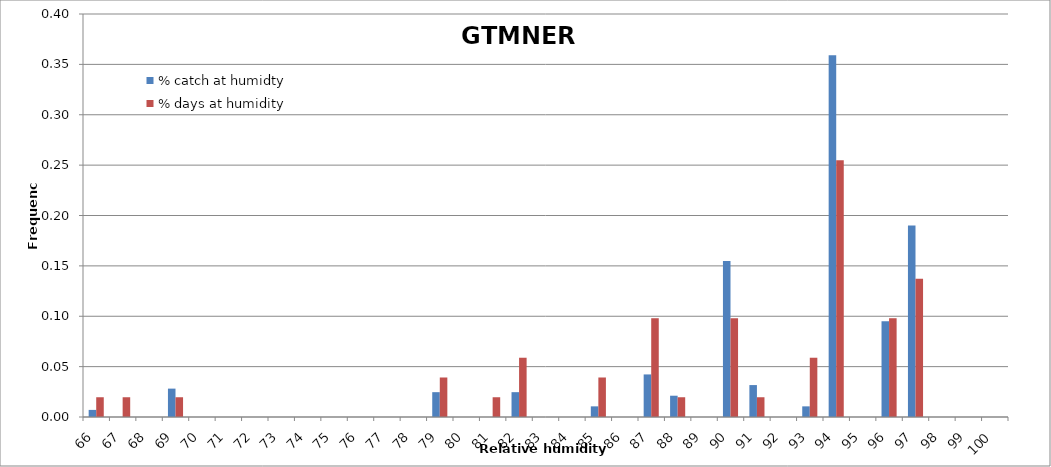
| Category | % catch at humidty | % days at humidity |
|---|---|---|
| 66.0 | 0.007 | 0.02 |
| 67.0 | 0 | 0.02 |
| 68.0 | 0 | 0 |
| 69.0 | 0.028 | 0.02 |
| 70.0 | 0 | 0 |
| 71.0 | 0 | 0 |
| 72.0 | 0 | 0 |
| 73.0 | 0 | 0 |
| 74.0 | 0 | 0 |
| 75.0 | 0 | 0 |
| 76.0 | 0 | 0 |
| 77.0 | 0 | 0 |
| 78.0 | 0 | 0 |
| 79.0 | 0.025 | 0.039 |
| 80.0 | 0 | 0 |
| 81.0 | 0 | 0.02 |
| 82.0 | 0.025 | 0.059 |
| 83.0 | 0 | 0 |
| 84.0 | 0 | 0 |
| 85.0 | 0.011 | 0.039 |
| 86.0 | 0 | 0 |
| 87.0 | 0.042 | 0.098 |
| 88.0 | 0.021 | 0.02 |
| 89.0 | 0 | 0 |
| 90.0 | 0.155 | 0.098 |
| 91.0 | 0.032 | 0.02 |
| 92.0 | 0 | 0 |
| 93.0 | 0.011 | 0.059 |
| 94.0 | 0.359 | 0.255 |
| 95.0 | 0 | 0 |
| 96.0 | 0.095 | 0.098 |
| 97.0 | 0.19 | 0.137 |
| 98.0 | 0 | 0 |
| 99.0 | 0 | 0 |
| 100.0 | 0 | 0 |